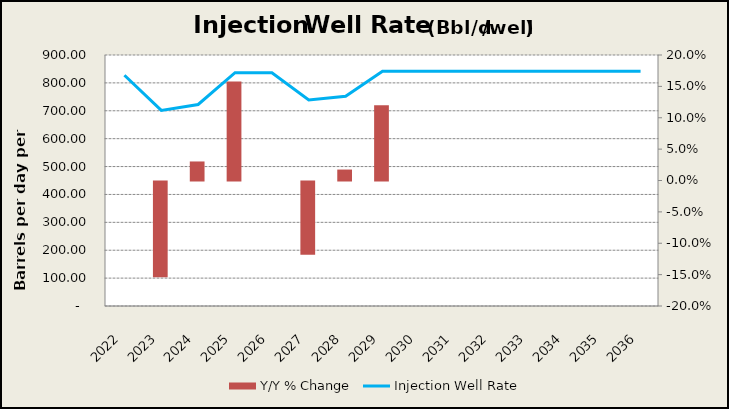
| Category | Y/Y % Change |
|---|---|
| 2022.0 | 0 |
| 2023.0 | -0.153 |
| 2024.0 | 0.03 |
| 2025.0 | 0.158 |
| 2026.0 | 0 |
| 2027.0 | -0.117 |
| 2028.0 | 0.017 |
| 2029.0 | 0.12 |
| 2030.0 | 0 |
| 2031.0 | 0 |
| 2032.0 | 0 |
| 2033.0 | 0 |
| 2034.0 | 0 |
| 2035.0 | 0 |
| 2036.0 | 0 |